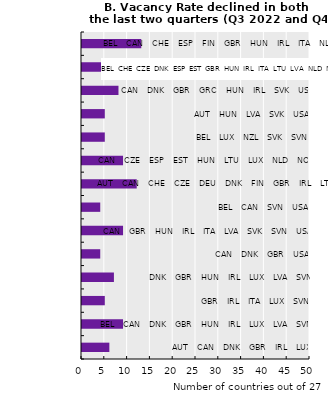
| Category | Number of countries | Labels SPOTS |
|---|---|---|
| 0 | 6 | 50 |
| 1 | 9 | 50 |
| 2 | 5 | 50 |
| 3 | 7 | 50 |
| 4 | 4 | 50 |
| 5 | 9 | 50 |
| 6 | 4 | 50 |
| 7 | 12 | 50 |
| 8 | 9 | 50 |
| 9 | 5 | 50 |
| 10 | 5 | 50 |
| 11 | 8 | 50 |
| 12 | 19 | 50 |
| 13 | 13 | 50 |